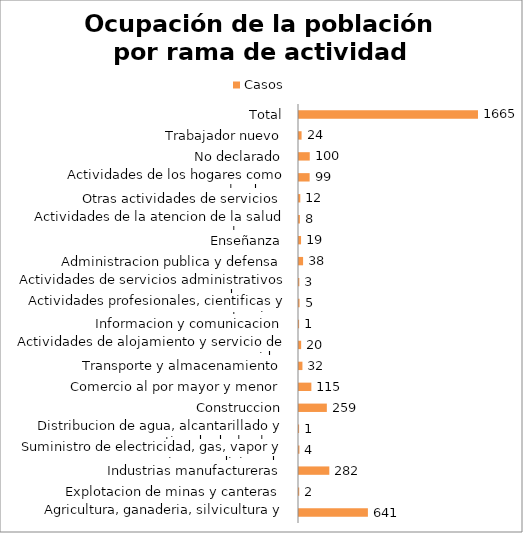
| Category | Casos |
|---|---|
|  Agricultura, ganaderia, silvicultura y pesca | 641 |
|  Explotacion de minas y canteras | 2 |
|  Industrias manufactureras | 282 |
|  Suministro de electricidad, gas, vapor y aire acondicionado | 4 |
|  Distribucion de agua, alcantarillado y gestion de deshechos | 1 |
|  Construccion | 259 |
|  Comercio al por mayor y menor | 115 |
|  Transporte y almacenamiento | 32 |
|  Actividades de alojamiento y servicio de comidas | 20 |
|  Informacion y comunicacion | 1 |
|  Actividades profesionales, cientificas y tecnicas | 5 |
|  Actividades de servicios administrativos y de apoyo | 3 |
|  Administracion publica y defensa | 38 |
|  Enseñanza | 19 |
|  Actividades de la atencion de la salud humana | 8 |
|  Otras actividades de servicios | 12 |
|  Actividades de los hogares como empleadores | 99 |
|  No declarado | 100 |
|  Trabajador nuevo | 24 |
|  Total | 1665 |